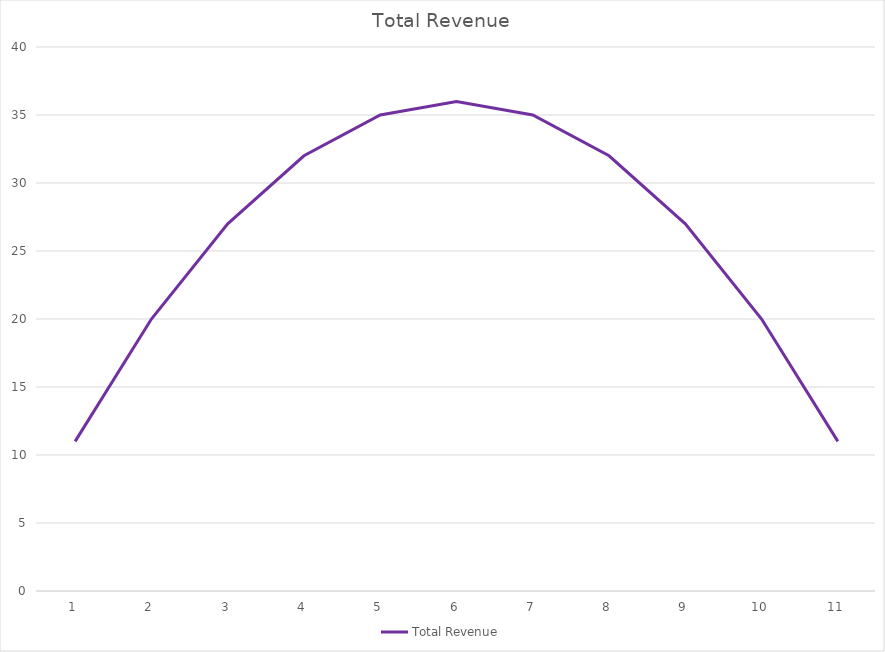
| Category | Total Revenue |
|---|---|
| 1.0 | 11 |
| 2.0 | 20 |
| 3.0 | 27 |
| 4.0 | 32 |
| 5.0 | 35 |
| 6.0 | 36 |
| 7.0 | 35 |
| 8.0 | 32 |
| 9.0 | 27 |
| 10.0 | 20 |
| 11.0 | 11 |